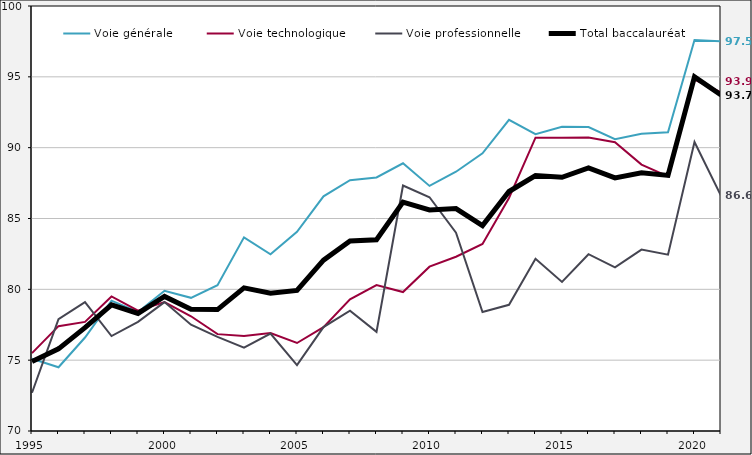
| Category | Voie générale  | Voie technologique | Voie professionnelle | Total baccalauréat |
|---|---|---|---|---|
| 1995 | 75.1 | 75.5 | 72.7 | 74.9 |
| 1996 | 74.5 | 77.4 | 77.9 | 75.8 |
| 1997 | 76.6 | 77.7 | 79.1 | 77.3 |
| 1998 | 79.2 | 79.5 | 76.7 | 78.9 |
| 1999 | 78.4 | 78.5 | 77.7 | 78.3 |
| 2000 | 79.9 | 79.1 | 79.1 | 79.5 |
| 2001 | 79.4 | 78.1 | 77.5 | 78.6 |
| 2002 | 80.297 | 76.838 | 76.645 | 78.57 |
| 2003 | 83.669 | 76.703 | 75.876 | 80.104 |
| 2004 | 82.477 | 76.92 | 76.873 | 79.725 |
| 2005 | 84.065 | 76.211 | 74.657 | 79.921 |
| 2006 | 86.566 | 77.333 | 77.333 | 82.056 |
| 2007 | 87.704 | 79.291 | 78.487 | 83.419 |
| 2008 | 87.9 | 80.3 | 77 | 83.5 |
| 2009 | 88.898 | 79.81 | 87.33 | 86.156 |
| 2010 | 87.3 | 81.6 | 86.5 | 85.6 |
| 2011 | 88.3 | 82.3 | 84 | 85.7 |
| 2012 | 89.6 | 83.2 | 78.4 | 84.5 |
| 2013 | 91.964 | 86.452 | 78.908 | 86.906 |
| 2014 | 90.953 | 90.702 | 82.162 | 88.031 |
| 2015 | 91.477 | 90.699 | 80.522 | 87.91 |
| 2016 | 91.452 | 90.724 | 82.48 | 88.575 |
| 2017 | 90.592 | 90.385 | 81.546 | 87.863 |
| 2018 | 90.979 | 88.808 | 82.806 | 88.233 |
| 2019 | 91.084 | 87.969 | 82.45 | 88.043 |
| 2020 | 97.6 | 94.8 | 90.4 | 95 |
| 2021 | 97.5 | 93.9 | 86.6 | 93.713 |